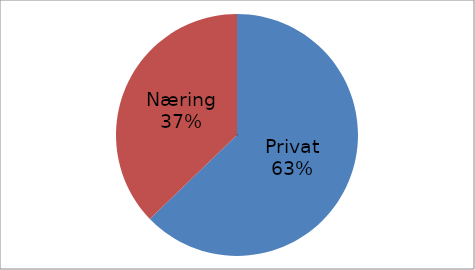
| Category | Series 0 |
|---|---|
| Privat | 35001928 |
| Næring | 20727332 |